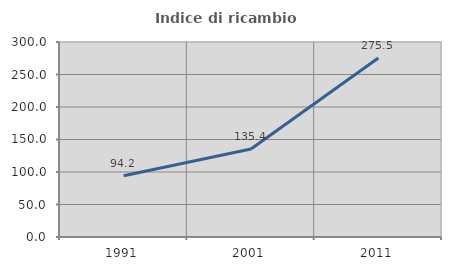
| Category | Indice di ricambio occupazionale  |
|---|---|
| 1991.0 | 94.191 |
| 2001.0 | 135.354 |
| 2011.0 | 275.51 |